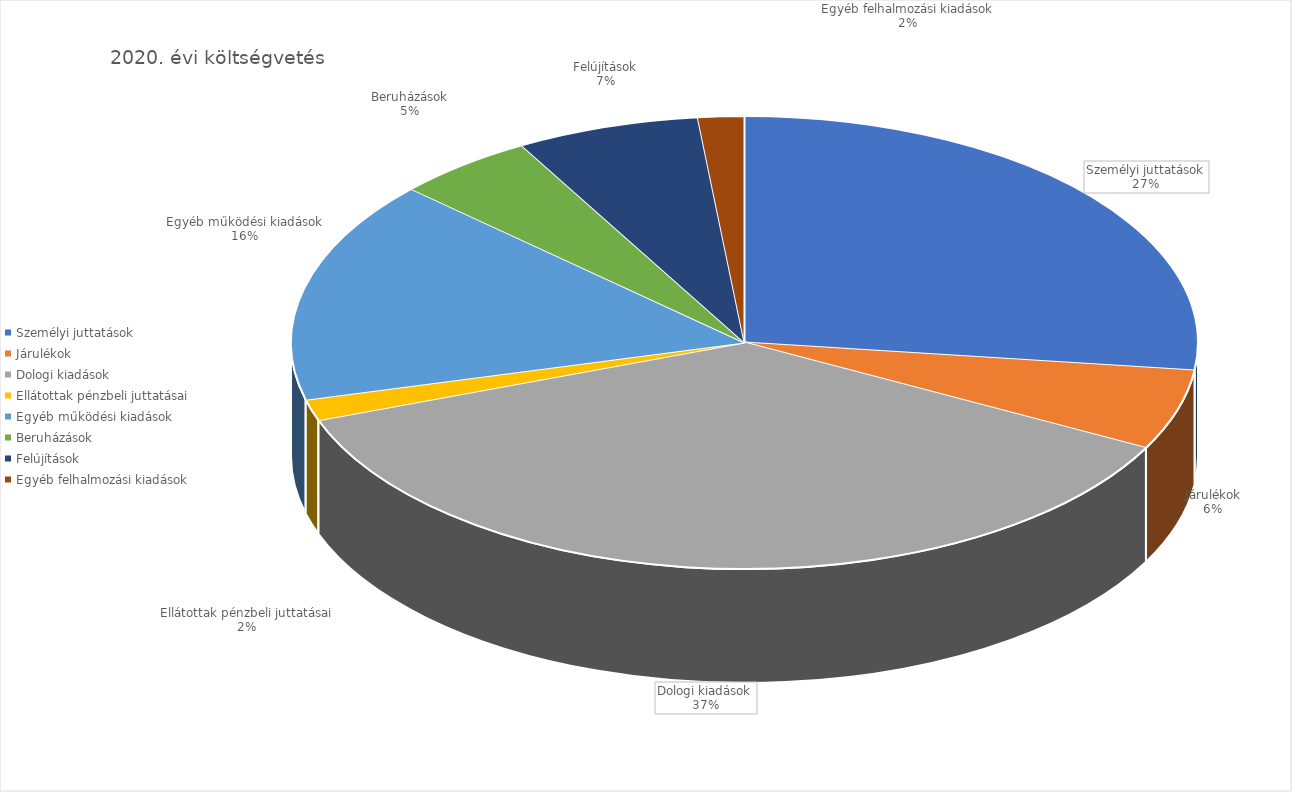
| Category | 2020 |
|---|---|
| Személyi juttatások | 8967604485 |
| Járulékok | 1904446184 |
| Dologi kiadások | 12208492414 |
| Ellátottak pénzbeli juttatásai | 498932891 |
| Egyéb működési kiadások | 5297068193 |
| Beruházások | 1648508317 |
| Felújítások | 2172637463 |
| Egyéb felhalmozási kiadások | 546532801 |